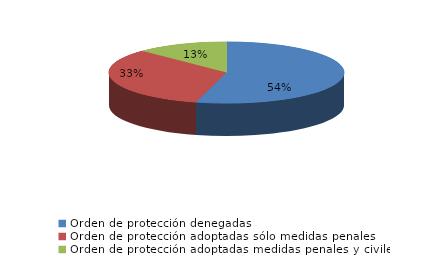
| Category | Series 0 |
|---|---|
| Orden de protección denegadas | 326 |
| Orden de protección adoptadas sólo medidas penales | 200 |
| Orden de protección adoptadas medidas penales y civiles | 76 |